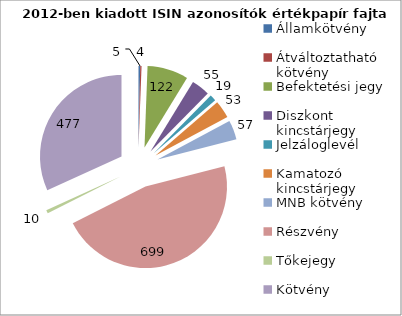
| Category | Series 0 |
|---|---|
| Államkötvény | 5 |
| Átváltoztatható kötvény | 4 |
| Befektetési jegy | 122 |
| Diszkont kincstárjegy | 55 |
| Jelzáloglevél | 19 |
| Kamatozó kincstárjegy | 53 |
| MNB kötvény | 57 |
| Részvény | 699 |
| Tőkejegy | 10 |
| Kötvény | 477 |